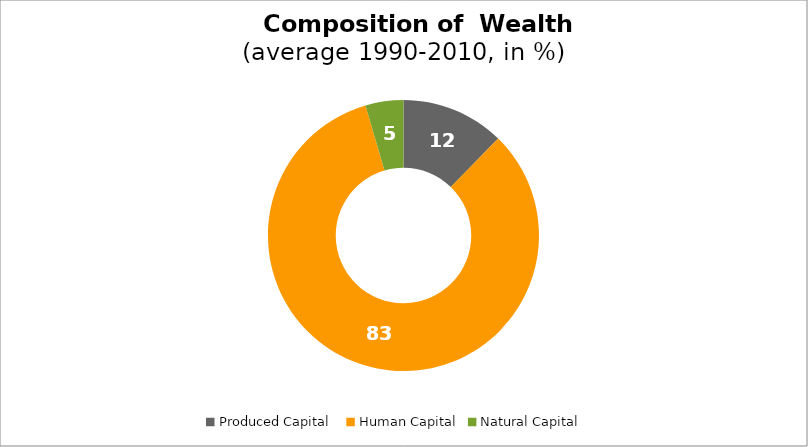
| Category | Series 0 |
|---|---|
| Produced Capital  | 12.308 |
| Human Capital | 83.169 |
| Natural Capital | 4.523 |